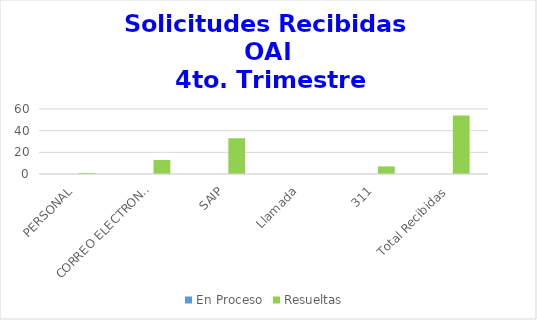
| Category | En Proceso | Resueltas  |
|---|---|---|
| PERSONAL | 0 | 1 |
| CORREO ELECTRONICO | 0 | 13 |
| SAIP | 0 | 33 |
| Llamada | 0 | 0 |
| 311 | 0 | 7 |
| Total Recibidas | 0 | 54 |